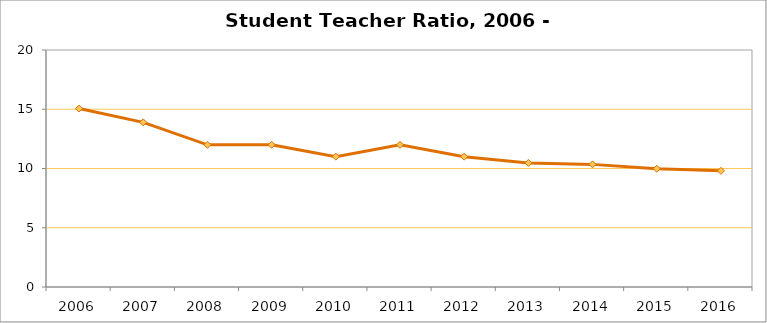
| Category | Student / Teacher Ratio  |
|---|---|
| 2006.0 | 15.06 |
| 2007.0 | 13.892 |
| 2008.0 | 12 |
| 2009.0 | 12 |
| 2010.0 | 11 |
| 2011.0 | 12 |
| 2012.0 | 11 |
| 2013.0 | 10.47 |
| 2014.0 | 10.348 |
| 2015.0 | 9.984 |
| 2016.0 | 9.801 |